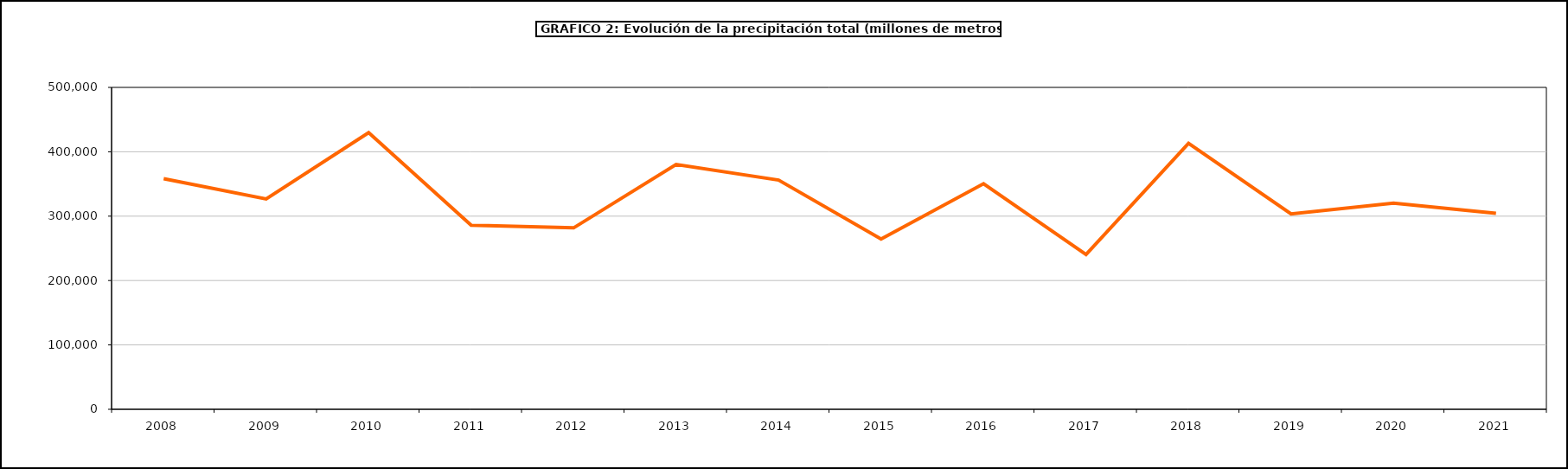
| Category | Series 0 |
|---|---|
| 2008.0 | 358273.25 |
| 2009.0 | 326778 |
| 2010.0 | 429768 |
| 2011.0 | 285948 |
| 2012.0 | 281817 |
| 2013.0 | 380420 |
| 2014.0 | 356097 |
| 2015.0 | 264511.7 |
| 2016.0 | 350442.2 |
| 2017.0 | 240463.8 |
| 2018.0 | 413003.9 |
| 2019.0 | 303475.4 |
| 2020.0 | 320234.1 |
| 2021.0 | 304476.4 |